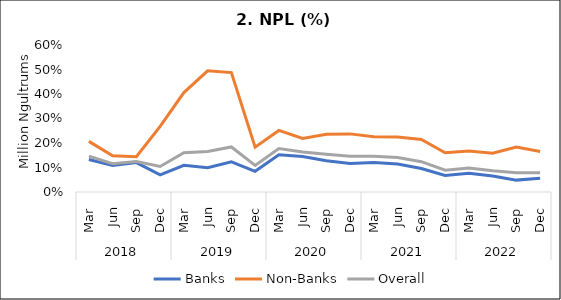
| Category | Banks | Non-Banks | Overall |
|---|---|---|---|
| 0 | 0.133 | 0.207 | 0.146 |
| 1 | 0.108 | 0.148 | 0.115 |
| 2 | 0.12 | 0.144 | 0.124 |
| 3 | 0.07 | 0.268 | 0.104 |
| 4 | 0.109 | 0.406 | 0.16 |
| 5 | 0.099 | 0.495 | 0.165 |
| 6 | 0.123 | 0.487 | 0.184 |
| 7 | 0.084 | 0.183 | 0.109 |
| 8 | 0.152 | 0.251 | 0.177 |
| 9 | 0.145 | 0.218 | 0.164 |
| 10 | 0.128 | 0.235 | 0.154 |
| 11 | 0.117 | 0.237 | 0.146 |
| 12 | 0.121 | 0.226 | 0.146 |
| 13 | 0.115 | 0.224 | 0.141 |
| 14 | 0.096 | 0.214 | 0.124 |
| 15 | 0.067 | 0.16 | 0.089 |
| 16 | 0.077 | 0.168 | 0.098 |
| 17 | 0.065 | 0.158 | 0.086 |
| 18 | 0.048 | 0.183 | 0.078 |
| 19 | 0.057 | 0.165 | 0.079 |